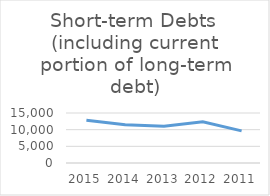
| Category | Short-term Debts 
(including current portion of long-term debt) |
|---|---|
| 2015.0 | 12846 |
| 2014.0 | 11501 |
| 2013.0 | 11031 |
| 2012.0 | 12391 |
| 2011.0 | 9648 |